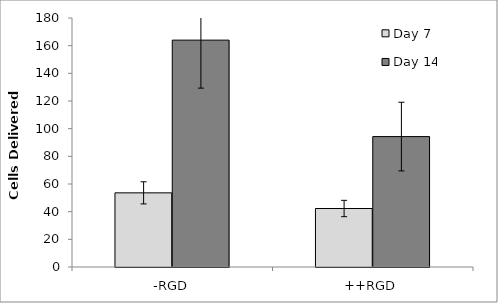
| Category | Day 7 | Day 14 |
|---|---|---|
| -RGD | 53.6 | 164 |
| ++RGD | 42.28 | 94.275 |